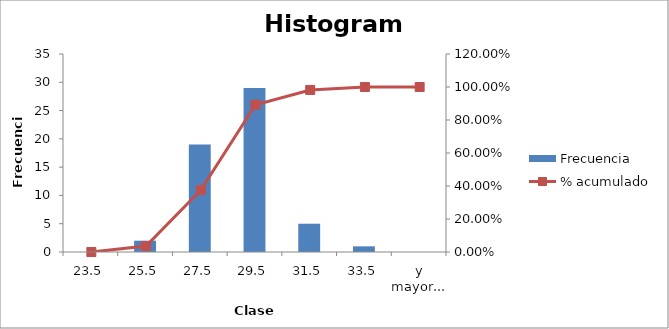
| Category | Frecuencia |
|---|---|
| 23.5 | 0 |
| 25.5 | 2 |
| 27.5 | 19 |
| 29.5 | 29 |
| 31.5 | 5 |
| 33.5 | 1 |
| y mayor... | 0 |